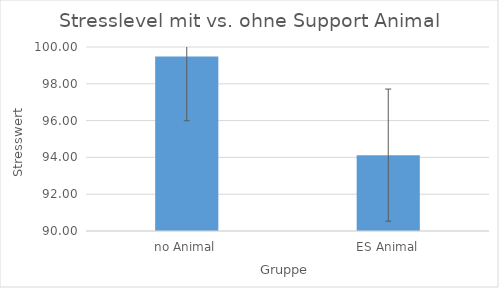
| Category | Mittelwert |
|---|---|
| no Animal | 99.482 |
| ES Animal | 94.123 |